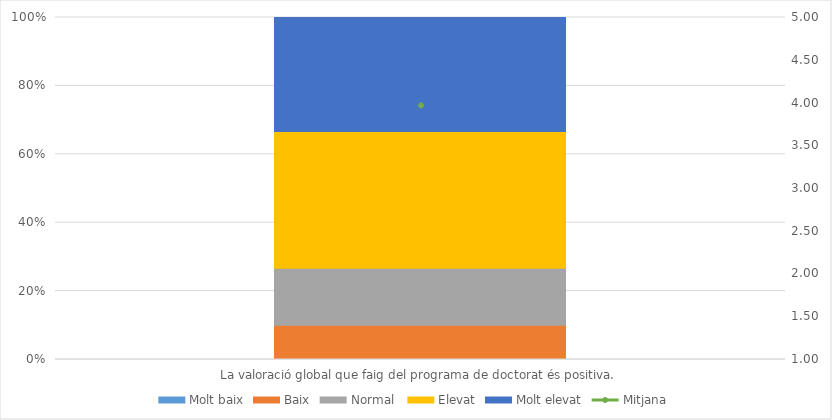
| Category | Molt baix | Baix | Normal  | Elevat | Molt elevat |
|---|---|---|---|---|---|
| La valoració global que faig del programa de doctorat és positiva. | 0 | 3 | 5 | 12 | 10 |